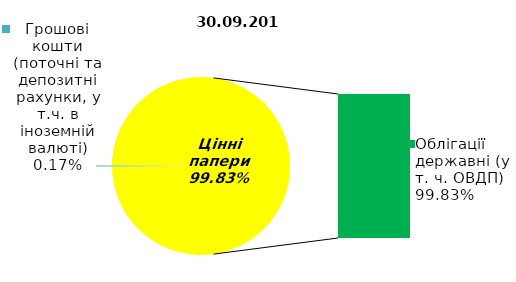
| Category | Series 0 |
|---|---|
| Грошові кошти (поточні та депозитні рахунки, у т.ч. в іноземній валюті) | 0.17 |
| Банківські метали | 0 |
| Нерухомість | 0 |
| Інші активи | 0 |
| Акції | 0 |
| Облігації підприємств | 0 |
| Муніципальні облігації | 0 |
| Облігації державні (у т. ч. ОВДП) | 97.58 |
| Іпотечні сертифікати | 0 |